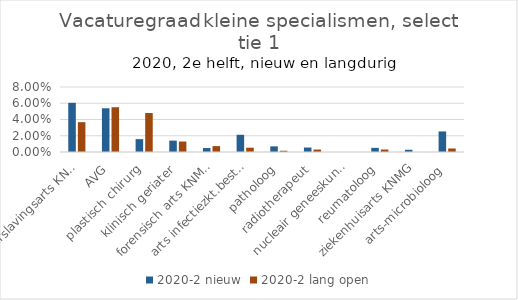
| Category | 2020-2 |
|---|---|
| verslavingsarts KNMG | 0.037 |
| AVG | 0.055 |
| plastisch chirurg | 0.048 |
| klinisch geriater | 0.013 |
| forensisch arts KNMG | 0.007 |
| arts infectiezkt.bestr. KNMG | 0.005 |
| patholoog | 0.002 |
| radiotherapeut | 0.003 |
| nucleair geneeskundige | 0 |
| reumatoloog | 0.003 |
| ziekenhuisarts KNMG | 0 |
| arts-microbioloog | 0.004 |